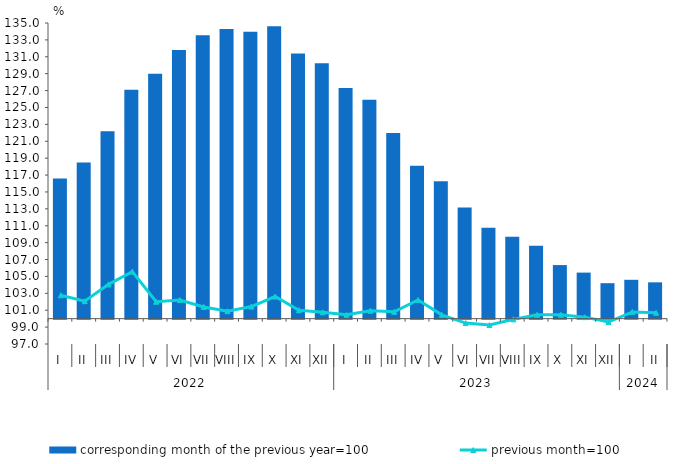
| Category | corresponding month of the previous year=100 |
|---|---|
| 0 | 116.6 |
| 1 | 118.5 |
| 2 | 122.2 |
| 3 | 127.1 |
| 4 | 129 |
| 5 | 131.8 |
| 6 | 133.55 |
| 7 | 134.29 |
| 8 | 133.97 |
| 9 | 134.62 |
| 10 | 131.4 |
| 11 | 130.24 |
| 12 | 127.307 |
| 13 | 125.905 |
| 14 | 121.977 |
| 15 | 118.102 |
| 16 | 116.262 |
| 17 | 113.152 |
| 18 | 110.755 |
| 19 | 109.689 |
| 20 | 108.634 |
| 21 | 106.342 |
| 22 | 105.453 |
| 23 | 104.2 |
| 24 | 104.6 |
| 25 | 104.3 |